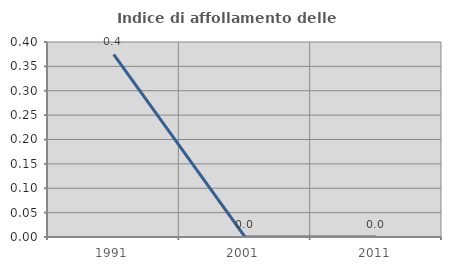
| Category | Indice di affollamento delle abitazioni  |
|---|---|
| 1991.0 | 0.375 |
| 2001.0 | 0 |
| 2011.0 | 0 |